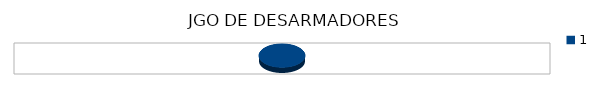
| Category | LUNES | MARTES | MIERCOLES | JUEVES  | VIERNES  | SABADO | DOMINGO |
|---|---|---|---|---|---|---|---|
| 0 | 1050 | 2100 | 1750 | 2450 | 3500 | 0 | 7000 |